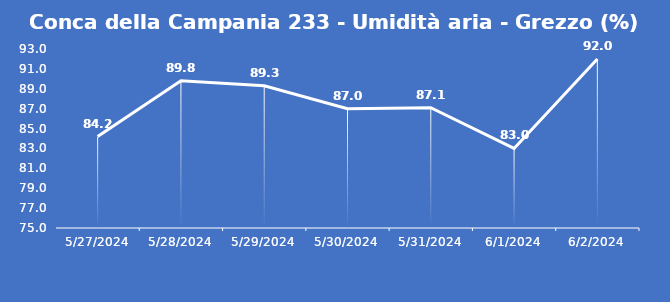
| Category | Conca della Campania 233 - Umidità aria - Grezzo (%) |
|---|---|
| 5/27/24 | 84.2 |
| 5/28/24 | 89.8 |
| 5/29/24 | 89.3 |
| 5/30/24 | 87 |
| 5/31/24 | 87.1 |
| 6/1/24 | 83 |
| 6/2/24 | 92 |